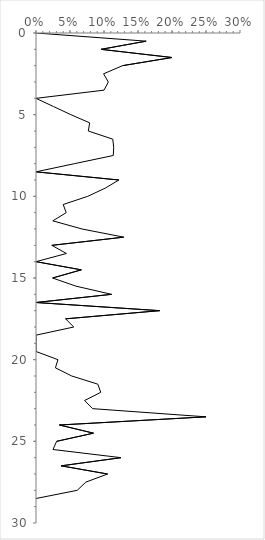
| Category | Series 0 |
|---|---|
| 0.0 | 0 |
| 0.1619718309859155 | 0.5 |
| 0.09558823529411764 | 1 |
| 0.2 | 1.5 |
| 0.12716763005780346 | 2 |
| 0.09937888198757763 | 2.5 |
| 0.10638297872340426 | 3 |
| 0.1 | 3.5 |
| 0.0 | 4 |
| 0.02564102564102564 | 4.5 |
| 0.05128205128205128 | 5 |
| 0.07894736842105263 | 5.5 |
| 0.07692307692307693 | 6 |
| 0.11290322580645161 | 6.5 |
| 0.11428571428571428 | 7 |
| 0.11363636363636363 | 7.5 |
| 0.05660377358490566 | 8 |
| 0.0 | 8.5 |
| 0.12195121951219512 | 9 |
| 0.1016949152542373 | 9.5 |
| 0.07608695652173914 | 10 |
| 0.04 | 10.5 |
| 0.044444444444444446 | 11 |
| 0.024691358024691357 | 11.5 |
| 0.06779661016949153 | 12 |
| 0.12903225806451613 | 12.5 |
| 0.023255813953488372 | 13 |
| 0.04477611940298507 | 13.5 |
| 0.0 | 14 |
| 0.06666666666666667 | 14.5 |
| 0.024390243902439025 | 15 |
| 0.058823529411764705 | 15.5 |
| 0.1111111111111111 | 16 |
| 0.0 | 16.5 |
| 0.18181818181818182 | 17 |
| 0.043478260869565216 | 17.5 |
| 0.05555555555555555 | 18 |
| 0.0 | 18.5 |
| 0.0 | 19 |
| 0.0 | 19.5 |
| 0.03225806451612903 | 20 |
| 0.02857142857142857 | 20.5 |
| 0.05263157894736842 | 21 |
| 0.09090909090909091 | 21.5 |
| 0.09523809523809523 | 22 |
| 0.07142857142857142 | 22.5 |
| 0.08333333333333333 | 23 |
| 0.25 | 23.5 |
| 0.034482758620689655 | 24 |
| 0.08450704225352113 | 24.5 |
| 0.030303030303030304 | 25 |
| 0.025 | 25.5 |
| 0.125 | 26 |
| 0.037037037037037035 | 26.5 |
| 0.10526315789473684 | 27 |
| 0.07317073170731707 | 27.5 |
| 0.06060606060606061 | 28 |
| 0.0 | 28.5 |